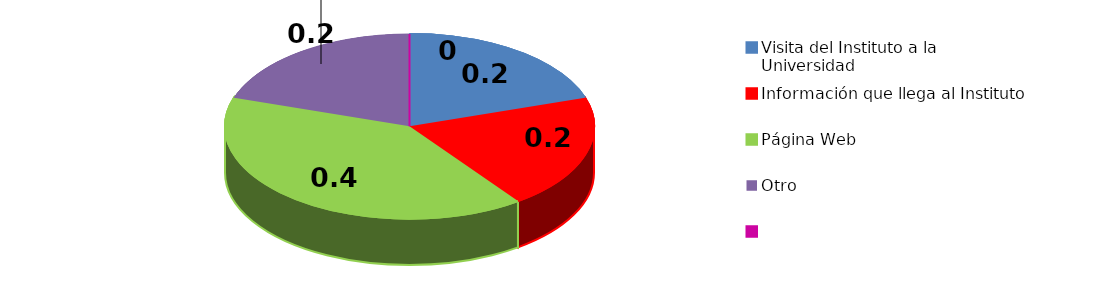
| Category | Sí | No |
|---|---|---|
| Visita del Instituto a la Universidad | 1 | 96 |
| Información que llega al Instituto | 1 | 97 |
| Página Web | 2 | 98 |
| Otro | 1 | 99 |